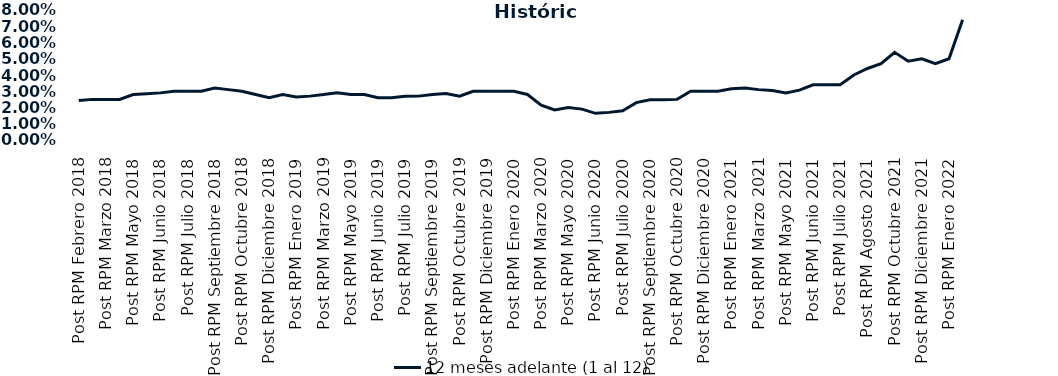
| Category | 12 meses adelante (1 al 12)  |
|---|---|
| Post RPM Febrero 2018 | 0.024 |
| Pre RPM Marzo 2018 | 0.025 |
| Post RPM Marzo 2018 | 0.025 |
| Pre RPM Mayo 2018 | 0.025 |
| Post RPM Mayo 2018 | 0.028 |
| Pre RPM Junio 2018 | 0.028 |
| Post RPM Junio 2018 | 0.029 |
| Pre RPM Julio 2018 | 0.03 |
| Post RPM Julio 2018 | 0.03 |
| Pre RPM Septiembre 2018 | 0.03 |
| Post RPM Septiembre 2018 | 0.032 |
| Pre RPM Octubre 2018 | 0.031 |
| Post RPM Octubre 2018 | 0.03 |
| Pre RPM Diciembre 2018 | 0.028 |
| Post RPM Diciembre 2018 | 0.026 |
| Pre RPM Enero 2019 | 0.028 |
| Post RPM Enero 2019 | 0.026 |
| Pre RPM Marzo 2019 | 0.027 |
| Post RPM Marzo 2019 | 0.028 |
| Pre RPM Mayo 2019 | 0.029 |
| Post RPM Mayo 2019 | 0.028 |
| Pre RPM Junio 2019 | 0.028 |
| Post RPM Junio 2019 | 0.026 |
| Pre RPM Julio 2019 | 0.026 |
| Post RPM Julio 2019 | 0.027 |
| Pre RPM Septiembre 2019 | 0.027 |
| Post RPM Septiembre 2019 | 0.028 |
| Pre RPM Octubre 2019 | 0.029 |
| Post RPM Octubre 2019 | 0.027 |
| Pre RPM Diciembre 2019 | 0.03 |
| Post RPM Diciembre 2019 | 0.03 |
| Pre RPM Enero 2020 | 0.03 |
| Post RPM Enero 2020 | 0.03 |
| Pre RPM Marzo 2020 | 0.028 |
| Post RPM Marzo 2020 | 0.022 |
| Pre RPM Mayo 2020 | 0.018 |
| Post RPM Mayo 2020 | 0.02 |
| Pre RPM Junio 2020 | 0.019 |
| Post RPM Junio 2020 | 0.016 |
| Pre RPM Julio 2020 | 0.017 |
| Post RPM Julio 2020 | 0.018 |
| Pre RPM Septiembre 2020 | 0.023 |
| Post RPM Septiembre 2020 | 0.025 |
| Pre RPM Octubre 2020 | 0.025 |
| Post RPM Octubre 2020 | 0.025 |
| Pre RPM Diciembre 2020 | 0.03 |
| Post RPM Diciembre 2020 | 0.03 |
| Pre RPM Enero 2021 | 0.03 |
| Post RPM Enero 2021 | 0.032 |
| Pre RPM Marzo 2021 | 0.032 |
| Post RPM Marzo 2021 | 0.031 |
| Pre RPM Mayo 2021 | 0.03 |
| Post RPM Mayo 2021 | 0.029 |
| Pre RPM Junio 2021 | 0.031 |
| Post RPM Junio 2021 | 0.034 |
| Pre RPM Julio 2021 | 0.034 |
| Post RPM Julio 2021 | 0.034 |
| Pre RPM Agosto 2021 | 0.04 |
| Post RPM Agosto 2021 | 0.044 |
| Pre RPM Octubre 2021 | 0.047 |
| Post RPM Octubre 2021 | 0.054 |
| Pre RPM Diciembre 2021 | 0.048 |
| Post RPM Diciembre 2021 | 0.05 |
| Pre RPM Enero 2022 | 0.047 |
| Post RPM Enero 2022 | 0.05 |
| Pre RPM Marzo 2022 | 0.074 |